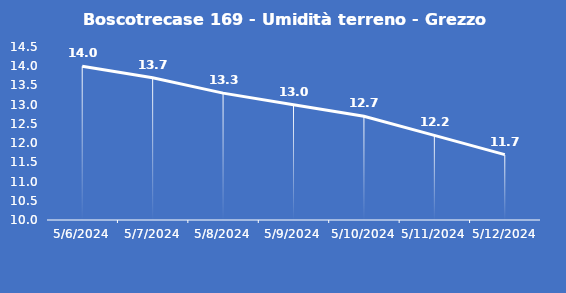
| Category | Boscotrecase 169 - Umidità terreno - Grezzo (%VWC) |
|---|---|
| 5/6/24 | 14 |
| 5/7/24 | 13.7 |
| 5/8/24 | 13.3 |
| 5/9/24 | 13 |
| 5/10/24 | 12.7 |
| 5/11/24 | 12.2 |
| 5/12/24 | 11.7 |